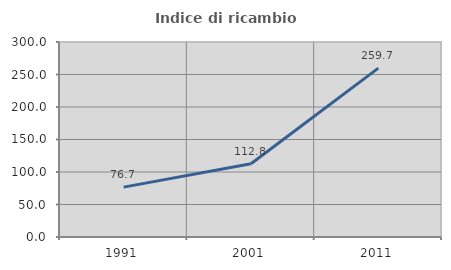
| Category | Indice di ricambio occupazionale  |
|---|---|
| 1991.0 | 76.748 |
| 2001.0 | 112.793 |
| 2011.0 | 259.732 |